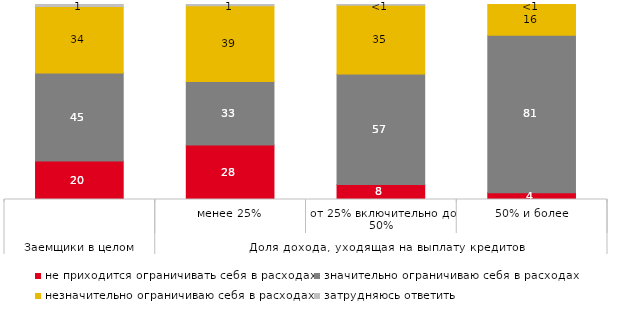
| Category | не приходится ограничивать себя в расходах | значительно ограничиваю себя в расходах | незначительно ограничиваю себя в расходах | затрудняюсь ответить |
|---|---|---|---|---|
| 0 | 19.763 | 45.089 | 34.083 | 1.065 |
| 1 | 27.891 | 32.653 | 38.776 | 0.68 |
| 2 | 7.725 | 56.652 | 35.193 | 0.429 |
| 3 | 3.509 | 80.702 | 15.789 | 0 |